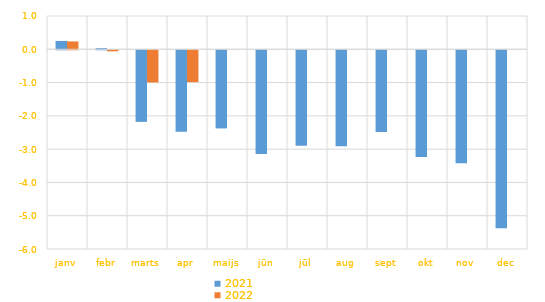
| Category | 2021 | 2022 |
|---|---|---|
| janv | 0.251 | 0.236 |
| febr | 0.033 | -0.031 |
| marts | -2.15 | -0.966 |
| apr | -2.448 | -0.954 |
| maijs | -2.348 | 0 |
| jūn | -3.115 | 0 |
| jūl | -2.871 | 0 |
| aug | -2.883 | 0 |
| sept | -2.456 | 0 |
| okt | -3.204 | 0 |
| nov | -3.393 | 0 |
| dec | -5.348 | 0 |